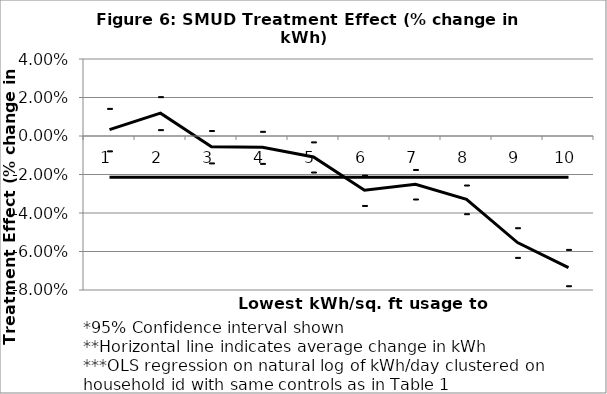
| Category | coeff | 2 SD below | 2 SD above | Average reduction |
|---|---|---|---|---|
| 0 | 0.003 | -0.008 | 0.014 | -0.021 |
| 1 | 0.012 | 0.003 | 0.02 | -0.021 |
| 2 | -0.006 | -0.014 | 0.003 | -0.021 |
| 3 | -0.006 | -0.014 | 0.002 | -0.021 |
| 4 | -0.011 | -0.019 | -0.003 | -0.021 |
| 5 | -0.028 | -0.036 | -0.02 | -0.021 |
| 6 | -0.025 | -0.033 | -0.017 | -0.021 |
| 7 | -0.033 | -0.04 | -0.025 | -0.021 |
| 8 | -0.055 | -0.063 | -0.048 | -0.021 |
| 9 | -0.068 | -0.078 | -0.059 | -0.021 |